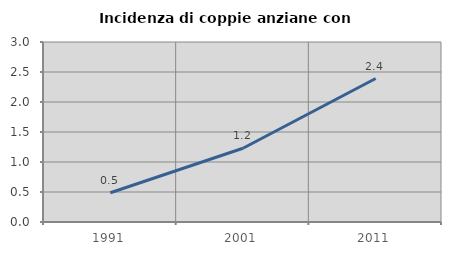
| Category | Incidenza di coppie anziane con figli |
|---|---|
| 1991.0 | 0.488 |
| 2001.0 | 1.229 |
| 2011.0 | 2.392 |